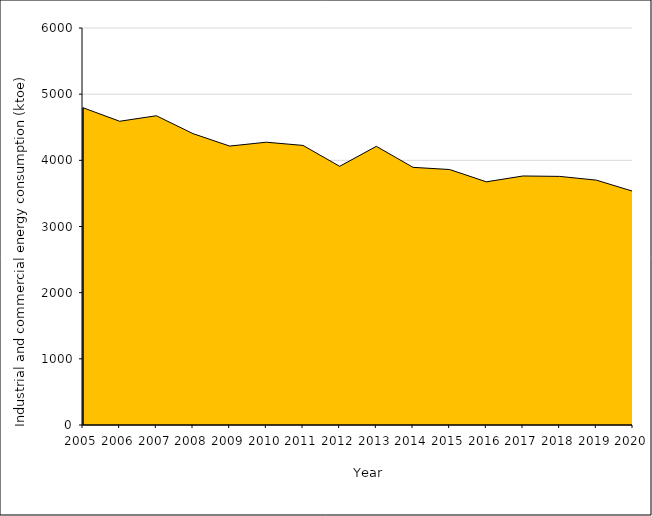
| Category | Industrial and commercial energy consumption (ktoe) |
|---|---|
| 2005.0 | 4794.88 |
| 2006.0 | 4590.605 |
| 2007.0 | 4673.718 |
| 2008.0 | 4403.461 |
| 2009.0 | 4215.453 |
| 2010.0 | 4273.845 |
| 2011.0 | 4225.585 |
| 2012.0 | 3909.431 |
| 2013.0 | 4211.559 |
| 2014.0 | 3894.256 |
| 2015.0 | 3861.103 |
| 2016.0 | 3675.335 |
| 2017.0 | 3763.531 |
| 2018.0 | 3757.098 |
| 2019.0 | 3700.816 |
| 2020.0 | 3531.935 |